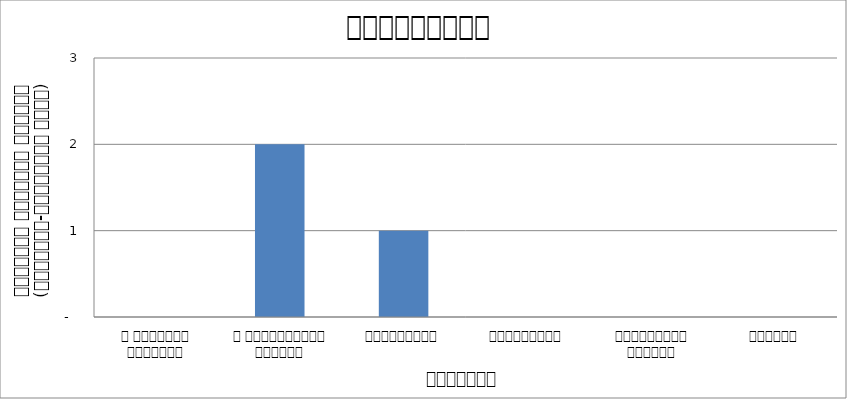
| Category | स्वास्थ्य  |
|---|---|
| द हिमालयन टाइम्स् | 0 |
| द काठमाण्डौं पोस्ट् | 2 |
| रिपब्लिका | 1 |
| कान्तिपुर | 0 |
| अन्नपूर्ण पोस्ट् | 0 |
| नागरिक | 0 |